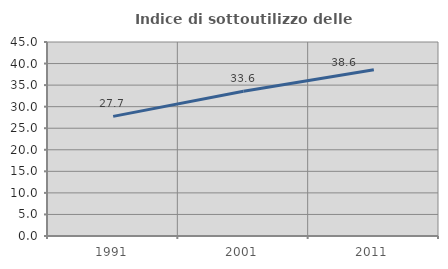
| Category | Indice di sottoutilizzo delle abitazioni  |
|---|---|
| 1991.0 | 27.746 |
| 2001.0 | 33.561 |
| 2011.0 | 38.576 |